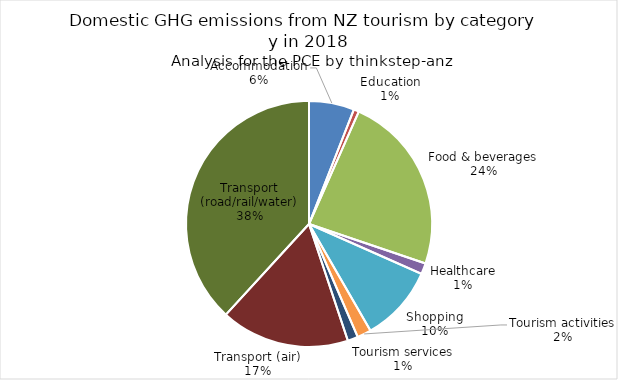
| Category | Series 0 |
|---|---|
| Accommodation | 444.584 |
| Education | 51.488 |
| Food & beverages | 1762.51 |
| Healthcare | 107.226 |
| Shopping | 750.81 |
| Tourism activities | 137.873 |
| Tourism services | 101.831 |
| Transport (air) | 1265.596 |
| Transport (road/rail/water) | 2856.156 |